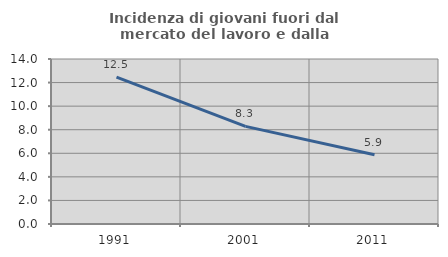
| Category | Incidenza di giovani fuori dal mercato del lavoro e dalla formazione  |
|---|---|
| 1991.0 | 12.463 |
| 2001.0 | 8.286 |
| 2011.0 | 5.882 |